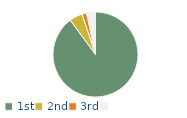
| Category | Series 0 |
|---|---|
| 1st | 89.9 |
| 2nd | 5 |
| 3rd | 1.7 |